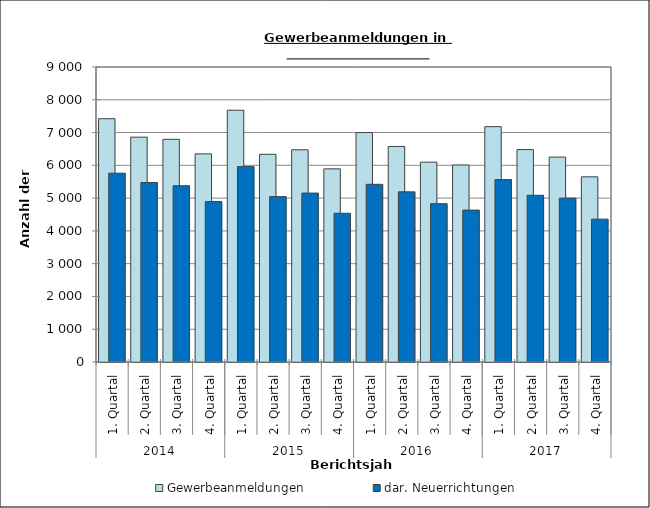
| Category | Gewerbeanmeldungen | dar. Neuerrichtungen |
|---|---|---|
| 0 | 7422 | 5760 |
| 1 | 6860 | 5477 |
| 2 | 6794 | 5377 |
| 3 | 6350 | 4895 |
| 4 | 7681 | 5962 |
| 5 | 6336 | 5046 |
| 6 | 6474 | 5153 |
| 7 | 5892 | 4537 |
| 8 | 7000 | 5421 |
| 9 | 6576 | 5191 |
| 10 | 6097 | 4829 |
| 11 | 6010 | 4634 |
| 12 | 7180 | 5564 |
| 13 | 6481 | 5086 |
| 14 | 6251 | 5000 |
| 15 | 5649 | 4358 |